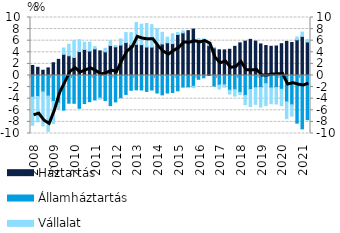
| Category | Háztartás | Államháztartás | Vállalat |
|---|---|---|---|
| 2008.0 | 1.722 | -3.74 | -4.839 |
| 2008.0 | 1.415 | -3.619 | -4.375 |
| 2008.0 | 0.905 | -2.834 | -5.853 |
| 2008.0 | 1.31 | -3.544 | -6.1 |
| 2009.0 | 2.195 | -4.472 | -3.8 |
| 2009.0 | 2.783 | -4.768 | -1.071 |
| 2009.0 | 3.659 | -5.969 | 1.081 |
| 2009.0 | 3.404 | -4.777 | 1.984 |
| 2010.0 | 3.104 | -4.789 | 2.953 |
| 2010.0 | 4.125 | -5.653 | 2.057 |
| 2010.0 | 4.487 | -4.841 | 1.254 |
| 2010.0 | 4.224 | -4.513 | 1.517 |
| 2011.0 | 4.593 | -4.218 | 0.395 |
| 2011.0 | 4.248 | -3.88 | -0.191 |
| 2011.0 | 4.081 | -4.31 | 0.612 |
| 2011.0 | 5.163 | -5.194 | 0.864 |
| 2012.0 | 4.949 | -4.553 | 0.228 |
| 2012.0 | 5.248 | -3.834 | 1.073 |
| 2012.0 | 5.679 | -3.266 | 1.724 |
| 2012.0 | 5.284 | -2.545 | 2.105 |
| 2013.0 | 5.378 | -2.474 | 3.759 |
| 2013.0 | 5.317 | -2.495 | 3.536 |
| 2013.0 | 4.91 | -2.742 | 4.057 |
| 2013.0 | 4.897 | -2.503 | 3.868 |
| 2014.0 | 5.308 | -3.022 | 2.777 |
| 2014.0 | 5.439 | -3.337 | 2.01 |
| 2014.0 | 5.65 | -3.015 | 0.964 |
| 2014.0 | 5.501 | -2.932 | 1.685 |
| 2015.0 | 7.073 | -2.642 | 0.332 |
| 2015.0 | 7.35 | -1.999 | 0.359 |
| 2015.0 | 7.728 | -2.071 | -0.021 |
| 2015.0 | 8.002 | -1.871 | -0.208 |
| 2016.0 | 6.141 | -0.656 | 0.214 |
| 2016.0 | 5.819 | -0.393 | 0.517 |
| 2016.0 | 5.147 | 0.088 | 0.269 |
| 2016.0 | 4.761 | -1.817 | 0.106 |
| 2017.0 | 4.434 | -1.659 | -0.667 |
| 2017.0 | 4.418 | -1.617 | -0.384 |
| 2017.0 | 4.52 | -2.536 | -0.656 |
| 2017.0 | 5.026 | -2.44 | -1.109 |
| 2018.0 | 5.623 | -2.913 | -0.367 |
| 2018.0 | 5.922 | -3.431 | -1.584 |
| 2018.0 | 6.232 | -2.413 | -2.948 |
| 2018.0 | 5.931 | -2.12 | -2.85 |
| 2019.0 | 5.442 | -2.087 | -3.345 |
| 2019.0 | 5.164 | -1.409 | -3.755 |
| 2019.0 | 5.037 | -2.153 | -2.714 |
| 2019.0 | 5.088 | -2.085 | -2.825 |
| 2020.0 | 5.484 | -2.374 | -2.83 |
| 2020.0 | 5.874 | -4.553 | -2.882 |
| 2020.0 | 5.689 | -5.056 | -1.951 |
| 2020.0 | 6.151 | -8.216 | 0.498 |
| 2021.0 | 6.74 | -9.203 | 0.743 |
| 2021.0 | 5.775 | -7.623 | 0.445 |